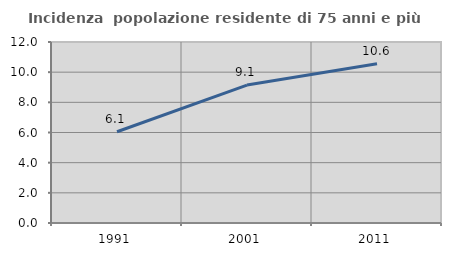
| Category | Incidenza  popolazione residente di 75 anni e più |
|---|---|
| 1991.0 | 6.05 |
| 2001.0 | 9.144 |
| 2011.0 | 10.561 |